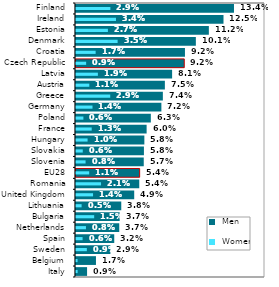
| Category |  Men |
|---|---|
| Italy | 0.009 |
| Belgium | 0.017 |
| Sweden | 0.029 |
| Spain | 0.032 |
| Netherlands | 0.037 |
| Bulgaria | 0.037 |
| Lithuania | 0.038 |
| United Kingdom | 0.049 |
| Romania | 0.054 |
| EU28 | 0.054 |
| Slovenia | 0.057 |
| Slovakia | 0.058 |
| Hungary | 0.058 |
| France | 0.06 |
| Poland | 0.063 |
| Germany | 0.072 |
| Greece | 0.074 |
| Austria | 0.075 |
| Latvia | 0.081 |
| Czech Republic | 0.092 |
| Croatia | 0.092 |
| Denmark | 0.101 |
| Estonia | 0.112 |
| Ireland | 0.125 |
| Finland | 0.134 |